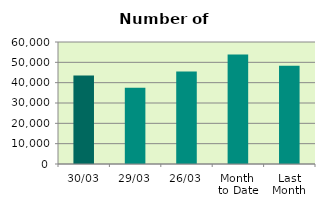
| Category | Series 0 |
|---|---|
| 30/03 | 43480 |
| 29/03 | 37552 |
| 26/03 | 45434 |
| Month 
to Date | 53852.636 |
| Last
Month | 48363.3 |